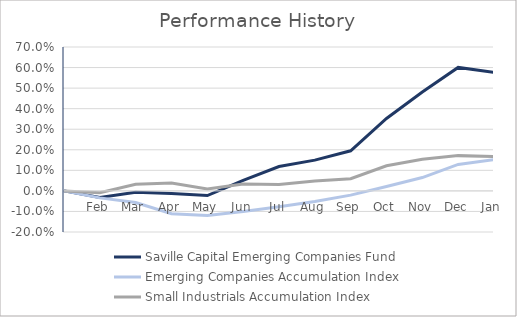
| Category | Saville Capital Emerging Companies Fund | Emerging Companies Accumulation Index | Small Industrials Accumulation Index |
|---|---|---|---|
|  | 0 | 0 | 0 |
| Feb | -0.032 | -0.034 | -0.009 |
| Mar | -0.007 | -0.056 | 0.033 |
| Apr | -0.013 | -0.111 | 0.038 |
| May | -0.022 | -0.12 | 0.009 |
| Jun | 0.052 | -0.1 | 0.034 |
| Jul | 0.119 | -0.078 | 0.031 |
| Aug | 0.149 | -0.052 | 0.049 |
| Sep | 0.195 | -0.021 | 0.06 |
| Oct | 0.352 | 0.022 | 0.122 |
| Nov | 0.481 | 0.065 | 0.154 |
| Dec | 0.601 | 0.129 | 0.172 |
| Jan | 0.576 | 0.152 | 0.167 |